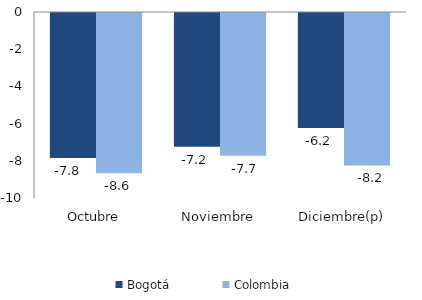
| Category | Bogotá | Colombia |
|---|---|---|
| Octubre | -7.796 | -8.616 |
| Noviembre | -7.192 | -7.675 |
| Diciembre(p) | -6.182 | -8.199 |